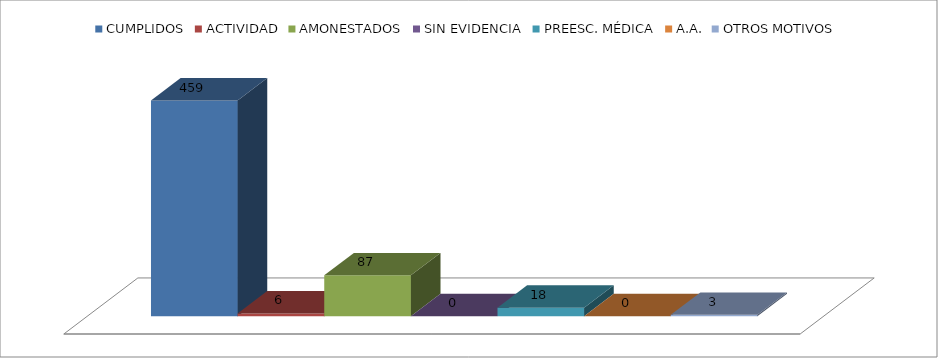
| Category | CUMPLIDOS | ACTIVIDAD | AMONESTADOS | SIN EVIDENCIA | PREESC. MÉDICA | A.A. | OTROS MOTIVOS |
|---|---|---|---|---|---|---|---|
|  | 459 | 6 | 87 | 0 | 18 | 0 | 3 |